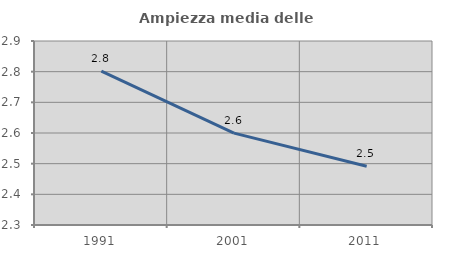
| Category | Ampiezza media delle famiglie |
|---|---|
| 1991.0 | 2.802 |
| 2001.0 | 2.599 |
| 2011.0 | 2.492 |